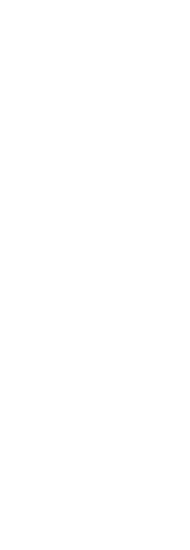
| Category | Series 10 | Mask |
|---|---|---|
| 0 |  | 1 |